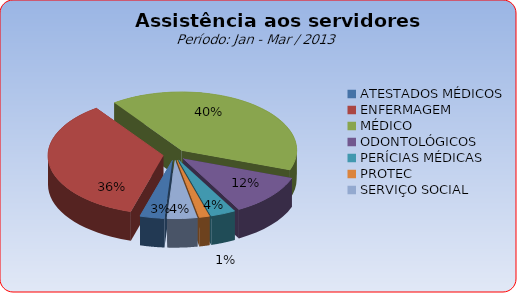
| Category | Series 0 |
|---|---|
| ATESTADOS MÉDICOS | 3.43 |
| ENFERMAGEM | 35.595 |
| MÉDICO | 40.32 |
| ODONTOLÓGICOS | 11.509 |
| PERÍCIAS MÉDICAS | 3.506 |
| PROTEC | 1.448 |
| SERVIÇO SOCIAL | 4.192 |